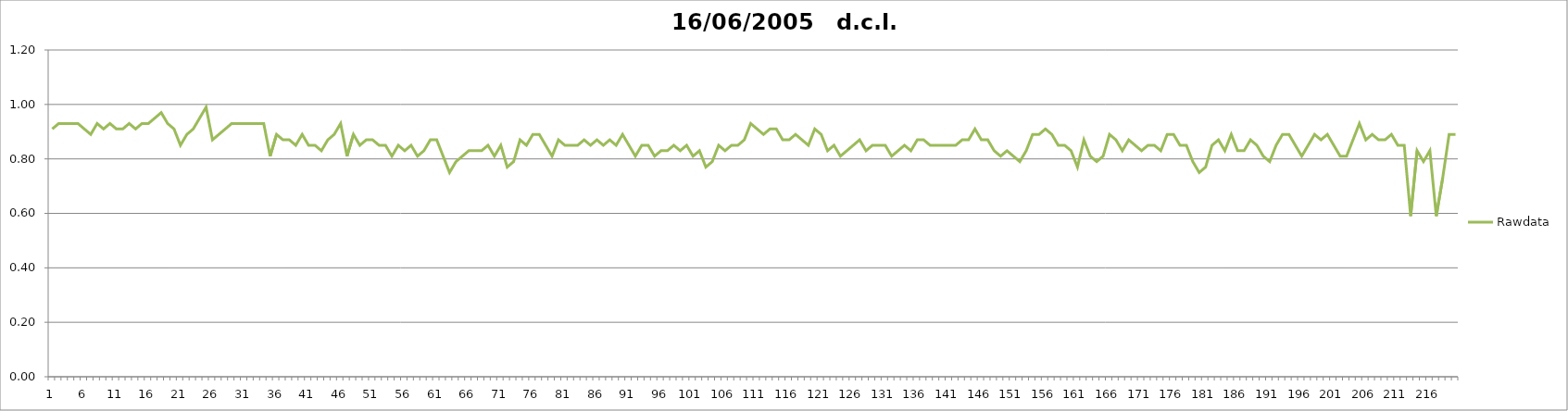
| Category | Rawdata |
|---|---|
| 0 | 0.91 |
| 1 | 0.93 |
| 2 | 0.93 |
| 3 | 0.93 |
| 4 | 0.93 |
| 5 | 0.91 |
| 6 | 0.89 |
| 7 | 0.93 |
| 8 | 0.91 |
| 9 | 0.93 |
| 10 | 0.91 |
| 11 | 0.91 |
| 12 | 0.93 |
| 13 | 0.91 |
| 14 | 0.93 |
| 15 | 0.93 |
| 16 | 0.95 |
| 17 | 0.97 |
| 18 | 0.93 |
| 19 | 0.91 |
| 20 | 0.85 |
| 21 | 0.89 |
| 22 | 0.91 |
| 23 | 0.95 |
| 24 | 0.99 |
| 25 | 0.87 |
| 26 | 0.89 |
| 27 | 0.91 |
| 28 | 0.93 |
| 29 | 0.93 |
| 30 | 0.93 |
| 31 | 0.93 |
| 32 | 0.93 |
| 33 | 0.93 |
| 34 | 0.81 |
| 35 | 0.89 |
| 36 | 0.87 |
| 37 | 0.87 |
| 38 | 0.85 |
| 39 | 0.89 |
| 40 | 0.85 |
| 41 | 0.85 |
| 42 | 0.83 |
| 43 | 0.87 |
| 44 | 0.89 |
| 45 | 0.93 |
| 46 | 0.81 |
| 47 | 0.89 |
| 48 | 0.85 |
| 49 | 0.87 |
| 50 | 0.87 |
| 51 | 0.85 |
| 52 | 0.85 |
| 53 | 0.81 |
| 54 | 0.85 |
| 55 | 0.83 |
| 56 | 0.85 |
| 57 | 0.81 |
| 58 | 0.83 |
| 59 | 0.87 |
| 60 | 0.87 |
| 61 | 0.81 |
| 62 | 0.75 |
| 63 | 0.79 |
| 64 | 0.81 |
| 65 | 0.83 |
| 66 | 0.83 |
| 67 | 0.83 |
| 68 | 0.85 |
| 69 | 0.81 |
| 70 | 0.85 |
| 71 | 0.77 |
| 72 | 0.79 |
| 73 | 0.87 |
| 74 | 0.85 |
| 75 | 0.89 |
| 76 | 0.89 |
| 77 | 0.85 |
| 78 | 0.81 |
| 79 | 0.87 |
| 80 | 0.85 |
| 81 | 0.85 |
| 82 | 0.85 |
| 83 | 0.87 |
| 84 | 0.85 |
| 85 | 0.87 |
| 86 | 0.85 |
| 87 | 0.87 |
| 88 | 0.85 |
| 89 | 0.89 |
| 90 | 0.85 |
| 91 | 0.81 |
| 92 | 0.85 |
| 93 | 0.85 |
| 94 | 0.81 |
| 95 | 0.83 |
| 96 | 0.83 |
| 97 | 0.85 |
| 98 | 0.83 |
| 99 | 0.85 |
| 100 | 0.81 |
| 101 | 0.83 |
| 102 | 0.77 |
| 103 | 0.79 |
| 104 | 0.85 |
| 105 | 0.83 |
| 106 | 0.85 |
| 107 | 0.85 |
| 108 | 0.87 |
| 109 | 0.93 |
| 110 | 0.91 |
| 111 | 0.89 |
| 112 | 0.91 |
| 113 | 0.91 |
| 114 | 0.87 |
| 115 | 0.87 |
| 116 | 0.89 |
| 117 | 0.87 |
| 118 | 0.85 |
| 119 | 0.91 |
| 120 | 0.89 |
| 121 | 0.83 |
| 122 | 0.85 |
| 123 | 0.81 |
| 124 | 0.83 |
| 125 | 0.85 |
| 126 | 0.87 |
| 127 | 0.83 |
| 128 | 0.85 |
| 129 | 0.85 |
| 130 | 0.85 |
| 131 | 0.81 |
| 132 | 0.83 |
| 133 | 0.85 |
| 134 | 0.83 |
| 135 | 0.87 |
| 136 | 0.87 |
| 137 | 0.85 |
| 138 | 0.85 |
| 139 | 0.85 |
| 140 | 0.85 |
| 141 | 0.85 |
| 142 | 0.87 |
| 143 | 0.87 |
| 144 | 0.91 |
| 145 | 0.87 |
| 146 | 0.87 |
| 147 | 0.83 |
| 148 | 0.81 |
| 149 | 0.83 |
| 150 | 0.81 |
| 151 | 0.79 |
| 152 | 0.83 |
| 153 | 0.89 |
| 154 | 0.89 |
| 155 | 0.91 |
| 156 | 0.89 |
| 157 | 0.85 |
| 158 | 0.85 |
| 159 | 0.83 |
| 160 | 0.77 |
| 161 | 0.87 |
| 162 | 0.81 |
| 163 | 0.79 |
| 164 | 0.81 |
| 165 | 0.89 |
| 166 | 0.87 |
| 167 | 0.83 |
| 168 | 0.87 |
| 169 | 0.85 |
| 170 | 0.83 |
| 171 | 0.85 |
| 172 | 0.85 |
| 173 | 0.83 |
| 174 | 0.89 |
| 175 | 0.89 |
| 176 | 0.85 |
| 177 | 0.85 |
| 178 | 0.79 |
| 179 | 0.75 |
| 180 | 0.77 |
| 181 | 0.85 |
| 182 | 0.87 |
| 183 | 0.83 |
| 184 | 0.89 |
| 185 | 0.83 |
| 186 | 0.83 |
| 187 | 0.87 |
| 188 | 0.85 |
| 189 | 0.81 |
| 190 | 0.79 |
| 191 | 0.85 |
| 192 | 0.89 |
| 193 | 0.89 |
| 194 | 0.85 |
| 195 | 0.81 |
| 196 | 0.85 |
| 197 | 0.89 |
| 198 | 0.87 |
| 199 | 0.89 |
| 200 | 0.85 |
| 201 | 0.81 |
| 202 | 0.81 |
| 203 | 0.87 |
| 204 | 0.93 |
| 205 | 0.87 |
| 206 | 0.89 |
| 207 | 0.87 |
| 208 | 0.87 |
| 209 | 0.89 |
| 210 | 0.85 |
| 211 | 0.85 |
| 212 | 0.59 |
| 213 | 0.83 |
| 214 | 0.79 |
| 215 | 0.83 |
| 216 | 0.59 |
| 217 | 0.73 |
| 218 | 0.89 |
| 219 | 0.89 |